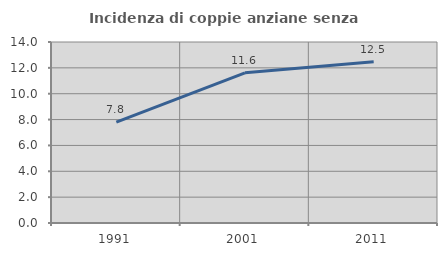
| Category | Incidenza di coppie anziane senza figli  |
|---|---|
| 1991.0 | 7.799 |
| 2001.0 | 11.614 |
| 2011.0 | 12.479 |